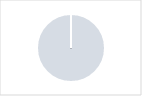
| Category | Series 0 |
|---|---|
| 0 | 0 |
| 1 | 9 |